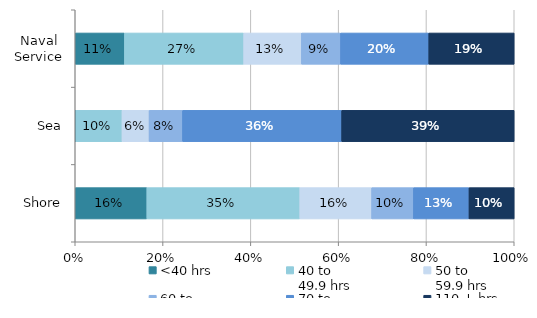
| Category | <40 hrs | 40 to 
49.9 hrs | 50 to 
59.9 hrs | 60 to 
69.9 hrs | 70 to 
109.9 hrs | 110 + hrs |
|---|---|---|---|---|---|---|
| Naval Service | 0.112 | 0.272 | 0.131 | 0.089 | 0.201 | 0.195 |
| Sea | 0.002 | 0.105 | 0.062 | 0.076 | 0.363 | 0.393 |
| Shore | 0.163 | 0.348 | 0.164 | 0.095 | 0.127 | 0.103 |